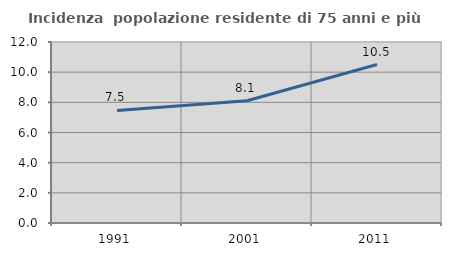
| Category | Incidenza  popolazione residente di 75 anni e più |
|---|---|
| 1991.0 | 7.464 |
| 2001.0 | 8.106 |
| 2011.0 | 10.507 |